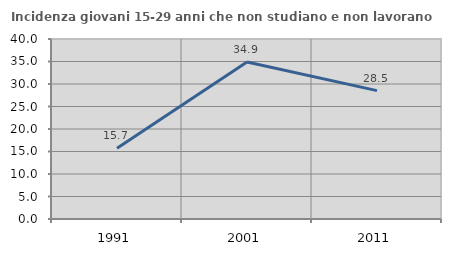
| Category | Incidenza giovani 15-29 anni che non studiano e non lavorano  |
|---|---|
| 1991.0 | 15.717 |
| 2001.0 | 34.891 |
| 2011.0 | 28.531 |